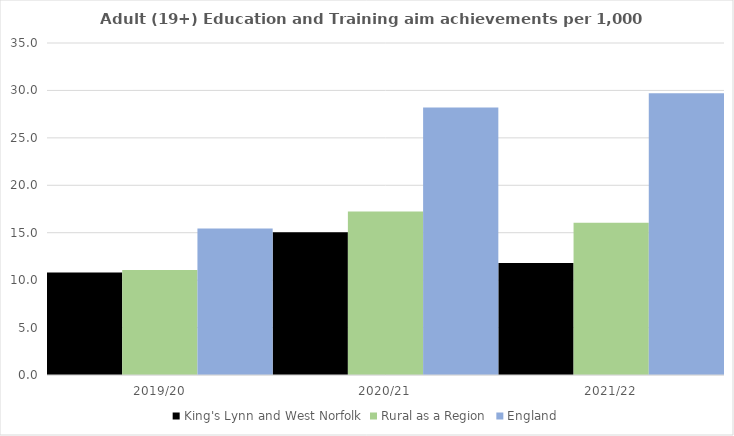
| Category | King's Lynn and West Norfolk | Rural as a Region | England |
|---|---|---|---|
| 2019/20 | 10.802 | 11.081 | 15.446 |
| 2020/21 | 15.054 | 17.224 | 28.211 |
| 2021/22 | 11.813 | 16.063 | 29.711 |